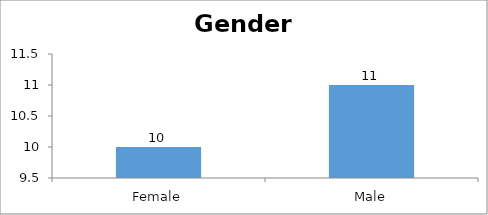
| Category | Gender |
|---|---|
| Female | 10 |
| Male | 11 |